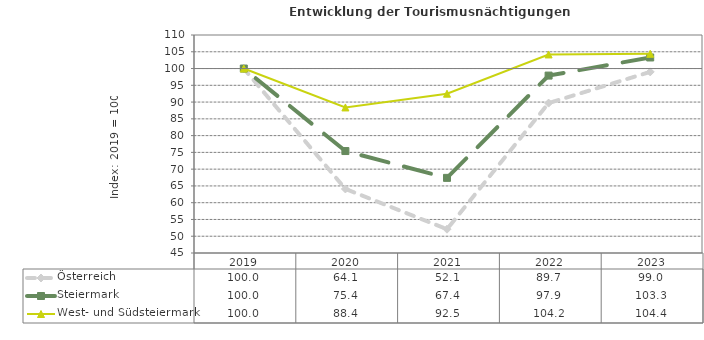
| Category | Österreich | Steiermark | West- und Südsteiermark |
|---|---|---|---|
| 2023.0 | 99 | 103.3 | 104.4 |
| 2022.0 | 89.7 | 97.9 | 104.2 |
| 2021.0 | 52.1 | 67.4 | 92.5 |
| 2020.0 | 64.1 | 75.4 | 88.4 |
| 2019.0 | 100 | 100 | 100 |